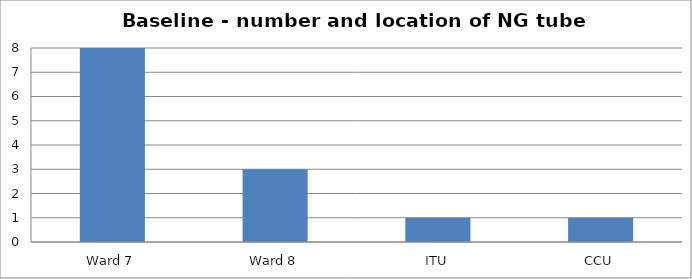
| Category | Series 0 |
|---|---|
| Ward 7 | 8 |
| Ward 8 | 3 |
| ITU | 1 |
| CCU | 1 |